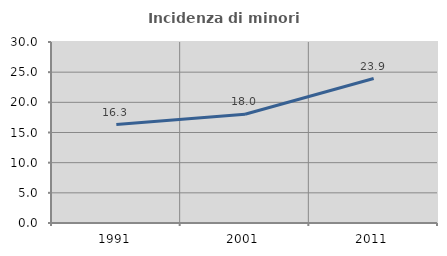
| Category | Incidenza di minori stranieri |
|---|---|
| 1991.0 | 16.323 |
| 2001.0 | 18.025 |
| 2011.0 | 23.94 |